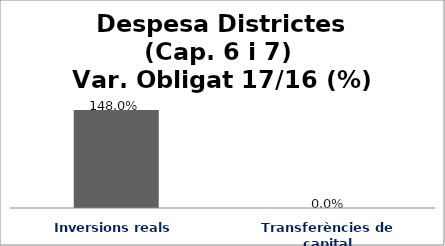
| Category | Series 0 |
|---|---|
| Inversions reals | 1.48 |
| Transferències de capital | 0 |